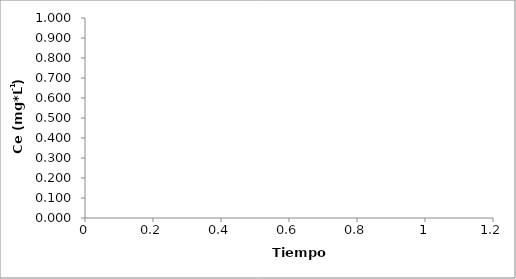
| Category | Series 0 |
|---|---|
|  | 0 |
|  | 0 |
|  | 0 |
|  | 0 |
|  | 0 |
|  | 0 |
|  | 0 |
|  | 0 |
|  | 0 |
|  | 0 |
|  | 0 |
|  | 0 |